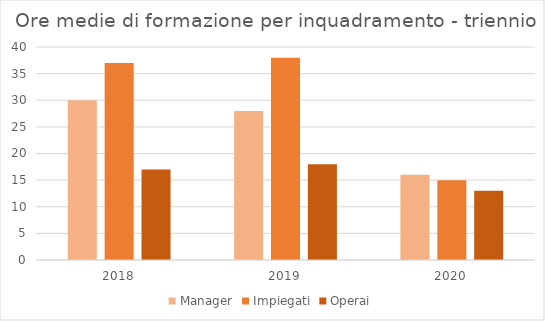
| Category | Manager | Impiegati | Operai |
|---|---|---|---|
| 2018.0 | 30 | 37 | 17 |
| 2019.0 | 28 | 38 | 18 |
| 2020.0 | 16 | 15 | 13 |